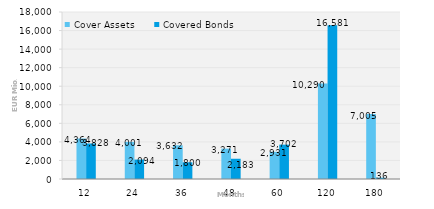
| Category | Cover Assets | Covered Bonds |
|---|---|---|
| 12.0 | 4364.295 | 3828.209 |
| 24.0 | 4000.517 | 2094 |
| 36.0 | 3631.865 | 1800 |
| 48.0 | 3270.991 | 2183 |
| 60.0 | 2930.64 | 3702 |
| 120.0 | 10290.341 | 16581 |
| 180.0 | 7005.007 | 136 |